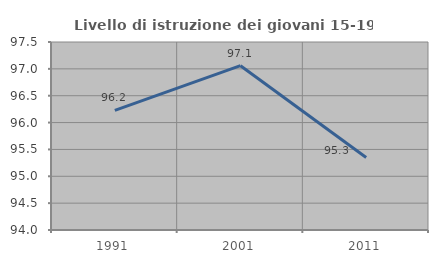
| Category | Livello di istruzione dei giovani 15-19 anni |
|---|---|
| 1991.0 | 96.226 |
| 2001.0 | 97.059 |
| 2011.0 | 95.349 |